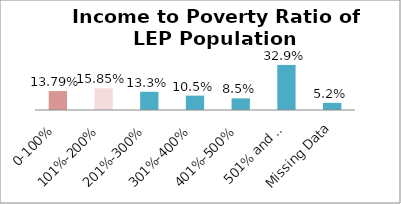
| Category | Percent |
|---|---|
| 0-100% | 0.138 |
| 101%-200% | 0.159 |
| 201%-300% | 0.133 |
| 301%-400% | 0.105 |
| 401%-500% | 0.085 |
| 501% and Over | 0.329 |
| Missing Data | 0.052 |